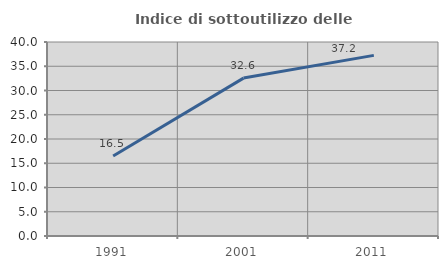
| Category | Indice di sottoutilizzo delle abitazioni  |
|---|---|
| 1991.0 | 16.505 |
| 2001.0 | 32.558 |
| 2011.0 | 37.246 |